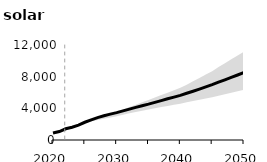
| Category | Ref |
|---|---|
| 2020.0 | 877.811 |
| 2021.0 | 1072.127 |
| 2022.0 | 1421.058 |
| 2023.0 | 1619.054 |
| 2024.0 | 1876.569 |
| 2025.0 | 2240.859 |
| 2026.0 | 2537.105 |
| 2027.0 | 2822.464 |
| 2028.0 | 3059.652 |
| 2029.0 | 3266.382 |
| 2030.0 | 3456.938 |
| 2031.0 | 3675.691 |
| 2032.0 | 3907.29 |
| 2033.0 | 4122.847 |
| 2034.0 | 4335.185 |
| 2035.0 | 4530.715 |
| 2036.0 | 4754.889 |
| 2037.0 | 4978.93 |
| 2038.0 | 5204.15 |
| 2039.0 | 5416.519 |
| 2040.0 | 5638.986 |
| 2041.0 | 5898.739 |
| 2042.0 | 6161.085 |
| 2043.0 | 6428.662 |
| 2044.0 | 6708.232 |
| 2045.0 | 6984.247 |
| 2046.0 | 7304.384 |
| 2047.0 | 7605.882 |
| 2048.0 | 7905.417 |
| 2049.0 | 8211.74 |
| 2050.0 | 8521.5 |